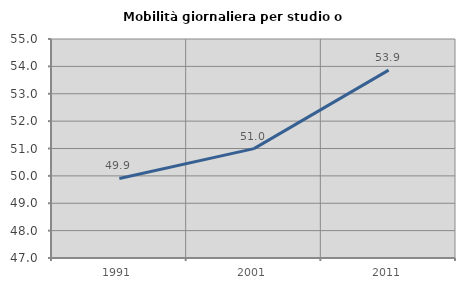
| Category | Mobilità giornaliera per studio o lavoro |
|---|---|
| 1991.0 | 49.904 |
| 2001.0 | 50.995 |
| 2011.0 | 53.863 |